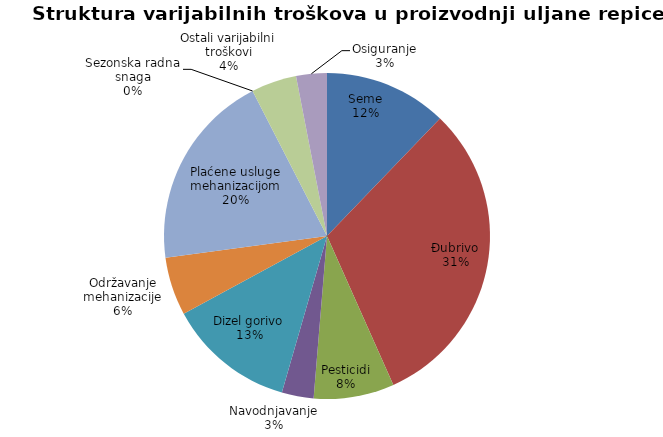
| Category | Series 0 |
|---|---|
| Seme | 8400 |
| Đubrivo | 21450 |
| Pesticidi | 5501 |
| Navodnjavanje | 2175 |
| Dizel gorivo | 8700 |
| Održavanje mehanizacije | 3970 |
| Plaćene usluge mehanizacijom | 13500 |
| Sezonska radna snaga | 0 |
| Ostali varijabilni troškovi | 3100 |
| Osiguranje | 2100 |